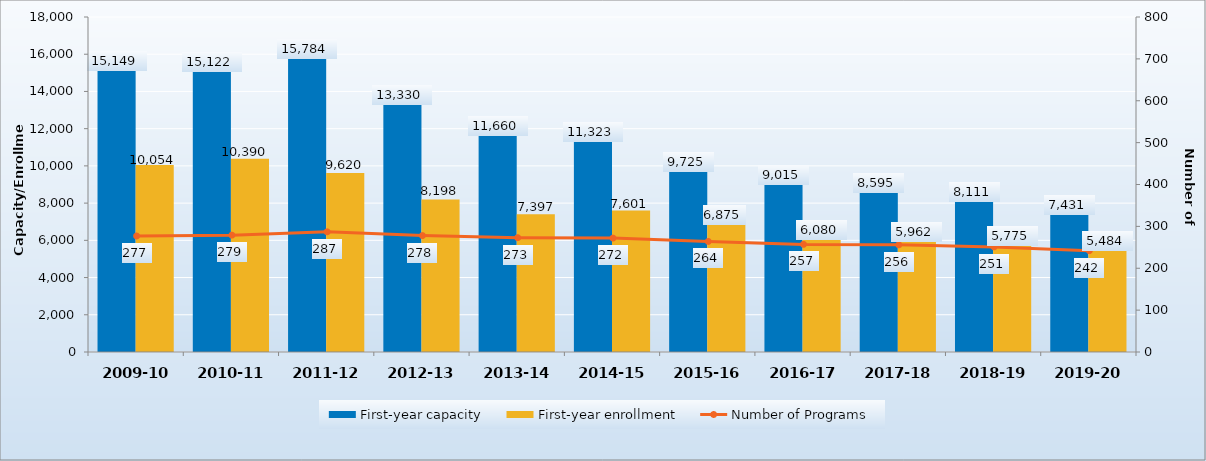
| Category | First-year capacity | First-year enrollment |
|---|---|---|
| 2009-10 | 15149 | 10054 |
| 2010-11 | 15122 | 10390 |
| 2011-12 | 15784 | 9620 |
| 2012-13 | 13330 | 8198 |
| 2013-14 | 11660 | 7397 |
| 2014-15 | 11323 | 7601 |
| 2015-16 | 9725 | 6875 |
| 2016-17 | 9015 | 6080 |
| 2017-18 | 8595 | 5962 |
| 2018-19 | 8111 | 5775 |
| 2019-20 | 7431 | 5484 |